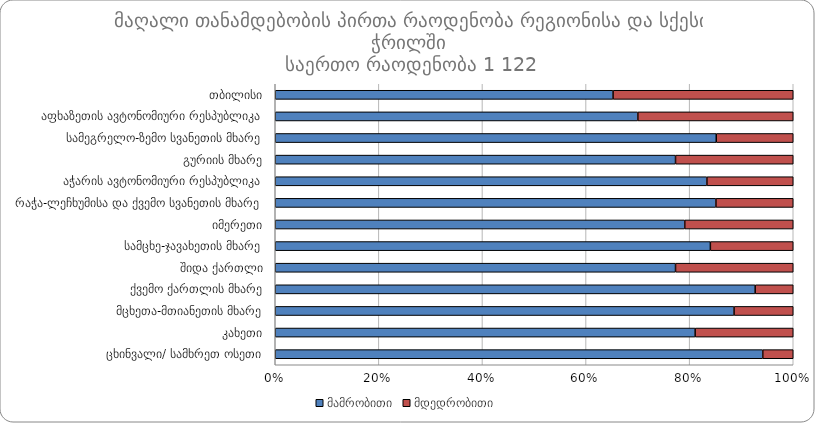
| Category |  მამრობითი |  მდედრობითი |
|---|---|---|
|  თბილისი | 150 | 80 |
|  აფხაზეთის ავტონომიური რესპუბლიკა | 28 | 12 |
|  სამეგრელო-ზემო სვანეთის მხარე | 63 | 11 |
|  გურიის მხარე | 34 | 10 |
|  აჭარის ავტონომიური რესპუბლიკა | 110 | 22 |
|  რაჭა-ლეჩხუმისა და ქვემო სვანეთის მხარე | 57 | 10 |
|  იმერეთი | 117 | 31 |
|  სამცხე-ჯავახეთის მხარე | 63 | 12 |
|  შიდა ქართლი | 51 | 15 |
|  ქვემო ქართლის მხარე | 63 | 5 |
|  მცხეთა-მთიანეთის მხარე | 31 | 4 |
|  კახეთი | 107 | 25 |
|  ცხინვალი/ სამხრეთ ოსეთი | 16 | 1 |